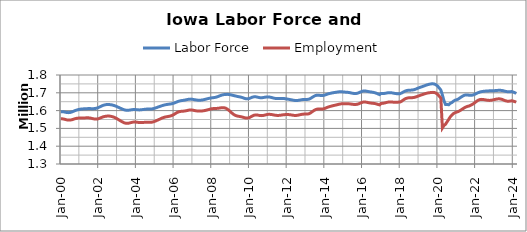
| Category |  Labor Force  |  Employment  |
|---|---|---|
| 2000-01-01 | 1593903 | 1554073 |
| 2000-02-01 | 1593990 | 1553843 |
| 2000-03-01 | 1592732 | 1552218 |
| 2000-04-01 | 1590764 | 1549882 |
| 2000-05-01 | 1589019 | 1547705 |
| 2000-06-01 | 1588514 | 1546565 |
| 2000-07-01 | 1589606 | 1546820 |
| 2000-08-01 | 1592249 | 1548545 |
| 2000-09-01 | 1595899 | 1551361 |
| 2000-10-01 | 1599621 | 1554252 |
| 2000-11-01 | 1602761 | 1556340 |
| 2000-12-01 | 1605280 | 1557642 |
| 2001-01-01 | 1607287 | 1558411 |
| 2001-02-01 | 1608759 | 1558748 |
| 2001-03-01 | 1609527 | 1558694 |
| 2001-04-01 | 1610026 | 1558753 |
| 2001-05-01 | 1610648 | 1559211 |
| 2001-06-01 | 1611094 | 1559480 |
| 2001-07-01 | 1611270 | 1559066 |
| 2001-08-01 | 1611115 | 1557650 |
| 2001-09-01 | 1610881 | 1555541 |
| 2001-10-01 | 1611068 | 1553561 |
| 2001-11-01 | 1611932 | 1552302 |
| 2001-12-01 | 1613910 | 1552463 |
| 2002-01-01 | 1617279 | 1554488 |
| 2002-02-01 | 1621675 | 1557984 |
| 2002-03-01 | 1626062 | 1561775 |
| 2002-04-01 | 1629632 | 1564963 |
| 2002-05-01 | 1632129 | 1567238 |
| 2002-06-01 | 1633682 | 1568717 |
| 2002-07-01 | 1634265 | 1569350 |
| 2002-08-01 | 1633924 | 1569033 |
| 2002-09-01 | 1632768 | 1567716 |
| 2002-10-01 | 1630876 | 1565447 |
| 2002-11-01 | 1628403 | 1562380 |
| 2002-12-01 | 1625147 | 1558284 |
| 2003-01-01 | 1621262 | 1553269 |
| 2003-02-01 | 1617184 | 1547884 |
| 2003-03-01 | 1613222 | 1542602 |
| 2003-04-01 | 1609268 | 1537462 |
| 2003-05-01 | 1605585 | 1532841 |
| 2003-06-01 | 1602990 | 1529681 |
| 2003-07-01 | 1601794 | 1528425 |
| 2003-08-01 | 1601957 | 1529011 |
| 2003-09-01 | 1603110 | 1530971 |
| 2003-10-01 | 1604550 | 1533278 |
| 2003-11-01 | 1605690 | 1535107 |
| 2003-12-01 | 1606085 | 1535920 |
| 2004-01-01 | 1605504 | 1535411 |
| 2004-02-01 | 1604405 | 1534065 |
| 2004-03-01 | 1603910 | 1533044 |
| 2004-04-01 | 1604462 | 1532911 |
| 2004-05-01 | 1605634 | 1533356 |
| 2004-06-01 | 1606835 | 1533841 |
| 2004-07-01 | 1607946 | 1534316 |
| 2004-08-01 | 1608630 | 1534570 |
| 2004-09-01 | 1608698 | 1534430 |
| 2004-10-01 | 1608704 | 1534379 |
| 2004-11-01 | 1609289 | 1535112 |
| 2004-12-01 | 1611006 | 1537097 |
| 2005-01-01 | 1613752 | 1540278 |
| 2005-02-01 | 1616939 | 1544054 |
| 2005-03-01 | 1620079 | 1547950 |
| 2005-04-01 | 1623189 | 1551978 |
| 2005-05-01 | 1626381 | 1556181 |
| 2005-06-01 | 1629285 | 1560026 |
| 2005-07-01 | 1631666 | 1562922 |
| 2005-08-01 | 1633524 | 1564894 |
| 2005-09-01 | 1635007 | 1566429 |
| 2005-10-01 | 1636188 | 1568012 |
| 2005-11-01 | 1637386 | 1570143 |
| 2005-12-01 | 1639110 | 1573366 |
| 2006-01-01 | 1641849 | 1578060 |
| 2006-02-01 | 1645442 | 1583664 |
| 2006-03-01 | 1649127 | 1588911 |
| 2006-04-01 | 1652328 | 1592837 |
| 2006-05-01 | 1654729 | 1595166 |
| 2006-06-01 | 1656339 | 1596192 |
| 2006-07-01 | 1657590 | 1596824 |
| 2006-08-01 | 1659099 | 1597910 |
| 2006-09-01 | 1661018 | 1599582 |
| 2006-10-01 | 1662986 | 1601611 |
| 2006-11-01 | 1664385 | 1603265 |
| 2006-12-01 | 1664469 | 1603613 |
| 2007-01-01 | 1663289 | 1602493 |
| 2007-02-01 | 1661602 | 1600672 |
| 2007-03-01 | 1659975 | 1598932 |
| 2007-04-01 | 1658797 | 1597745 |
| 2007-05-01 | 1658248 | 1597178 |
| 2007-06-01 | 1658520 | 1597354 |
| 2007-07-01 | 1659537 | 1598096 |
| 2007-08-01 | 1661174 | 1599243 |
| 2007-09-01 | 1663352 | 1600949 |
| 2007-10-01 | 1665743 | 1603116 |
| 2007-11-01 | 1667996 | 1605547 |
| 2007-12-01 | 1670033 | 1608126 |
| 2008-01-01 | 1671514 | 1610160 |
| 2008-02-01 | 1672496 | 1611271 |
| 2008-03-01 | 1673699 | 1611773 |
| 2008-04-01 | 1675641 | 1612124 |
| 2008-05-01 | 1678567 | 1612887 |
| 2008-06-01 | 1682183 | 1614205 |
| 2008-07-01 | 1685651 | 1615698 |
| 2008-08-01 | 1688328 | 1616614 |
| 2008-09-01 | 1689996 | 1616033 |
| 2008-10-01 | 1690958 | 1613479 |
| 2008-11-01 | 1691223 | 1608748 |
| 2008-12-01 | 1690582 | 1602026 |
| 2009-01-01 | 1689096 | 1594063 |
| 2009-02-01 | 1687015 | 1585947 |
| 2009-03-01 | 1684717 | 1578852 |
| 2009-04-01 | 1682539 | 1573692 |
| 2009-05-01 | 1680503 | 1570351 |
| 2009-06-01 | 1678718 | 1568344 |
| 2009-07-01 | 1676953 | 1566823 |
| 2009-08-01 | 1674750 | 1565031 |
| 2009-09-01 | 1671946 | 1562768 |
| 2009-10-01 | 1668747 | 1560093 |
| 2009-11-01 | 1666336 | 1558033 |
| 2009-12-01 | 1666046 | 1557898 |
| 2010-01-01 | 1668161 | 1560395 |
| 2010-02-01 | 1671781 | 1564951 |
| 2010-03-01 | 1675368 | 1570007 |
| 2010-04-01 | 1677557 | 1573836 |
| 2010-05-01 | 1677764 | 1575622 |
| 2010-06-01 | 1676132 | 1575290 |
| 2010-07-01 | 1673866 | 1573698 |
| 2010-08-01 | 1672341 | 1572218 |
| 2010-09-01 | 1672191 | 1571768 |
| 2010-10-01 | 1673392 | 1572819 |
| 2010-11-01 | 1675189 | 1574964 |
| 2010-12-01 | 1676546 | 1577238 |
| 2011-01-01 | 1676887 | 1578751 |
| 2011-02-01 | 1676002 | 1579056 |
| 2011-03-01 | 1674053 | 1578220 |
| 2011-04-01 | 1671639 | 1576628 |
| 2011-05-01 | 1669479 | 1574841 |
| 2011-06-01 | 1668016 | 1573438 |
| 2011-07-01 | 1667412 | 1572853 |
| 2011-08-01 | 1667469 | 1573169 |
| 2011-09-01 | 1667811 | 1574205 |
| 2011-10-01 | 1668085 | 1575631 |
| 2011-11-01 | 1667807 | 1576906 |
| 2011-12-01 | 1666736 | 1577591 |
| 2012-01-01 | 1665187 | 1577773 |
| 2012-02-01 | 1663580 | 1577533 |
| 2012-03-01 | 1662015 | 1576690 |
| 2012-04-01 | 1660230 | 1575227 |
| 2012-05-01 | 1658427 | 1573642 |
| 2012-06-01 | 1657167 | 1572697 |
| 2012-07-01 | 1656736 | 1572880 |
| 2012-08-01 | 1657235 | 1574109 |
| 2012-09-01 | 1658681 | 1576085 |
| 2012-10-01 | 1660482 | 1578228 |
| 2012-11-01 | 1661913 | 1579766 |
| 2012-12-01 | 1662647 | 1580457 |
| 2013-01-01 | 1662643 | 1580382 |
| 2013-02-01 | 1662690 | 1580469 |
| 2013-03-01 | 1664171 | 1582269 |
| 2013-04-01 | 1668153 | 1586806 |
| 2013-05-01 | 1673821 | 1593137 |
| 2013-06-01 | 1679506 | 1599483 |
| 2013-07-01 | 1683993 | 1604608 |
| 2013-08-01 | 1686408 | 1607835 |
| 2013-09-01 | 1686554 | 1609044 |
| 2013-10-01 | 1685404 | 1608832 |
| 2013-11-01 | 1684452 | 1608558 |
| 2013-12-01 | 1684792 | 1609386 |
| 2014-01-01 | 1686880 | 1611910 |
| 2014-02-01 | 1690118 | 1615655 |
| 2014-03-01 | 1693311 | 1619332 |
| 2014-04-01 | 1695751 | 1622168 |
| 2014-05-01 | 1697727 | 1624533 |
| 2014-06-01 | 1699665 | 1626906 |
| 2014-07-01 | 1701256 | 1628984 |
| 2014-08-01 | 1702696 | 1630943 |
| 2014-09-01 | 1704150 | 1633086 |
| 2014-10-01 | 1705341 | 1635343 |
| 2014-11-01 | 1705842 | 1637265 |
| 2014-12-01 | 1705596 | 1638437 |
| 2015-01-01 | 1704798 | 1638800 |
| 2015-02-01 | 1703904 | 1638715 |
| 2015-03-01 | 1703231 | 1638687 |
| 2015-04-01 | 1702323 | 1638444 |
| 2015-05-01 | 1700817 | 1637661 |
| 2015-06-01 | 1698838 | 1636400 |
| 2015-07-01 | 1697034 | 1635142 |
| 2015-08-01 | 1696005 | 1634411 |
| 2015-09-01 | 1696155 | 1634605 |
| 2015-10-01 | 1697907 | 1636189 |
| 2015-11-01 | 1701237 | 1639252 |
| 2015-12-01 | 1705328 | 1643195 |
| 2016-01-01 | 1708738 | 1646660 |
| 2016-02-01 | 1710383 | 1648419 |
| 2016-03-01 | 1710050 | 1648133 |
| 2016-04-01 | 1708496 | 1646486 |
| 2016-05-01 | 1706702 | 1644496 |
| 2016-06-01 | 1705132 | 1642812 |
| 2016-07-01 | 1703877 | 1641745 |
| 2016-08-01 | 1702459 | 1640827 |
| 2016-09-01 | 1700400 | 1639444 |
| 2016-10-01 | 1697326 | 1637247 |
| 2016-11-01 | 1693569 | 1634566 |
| 2016-12-01 | 1689919 | 1632092 |
| 2017-01-01 | 1696536 | 1640207 |
| 2017-02-01 | 1695743 | 1640706 |
| 2017-03-01 | 1696350 | 1642428 |
| 2017-04-01 | 1697896 | 1644766 |
| 2017-05-01 | 1699561 | 1646955 |
| 2017-06-01 | 1700553 | 1648287 |
| 2017-07-01 | 1700544 | 1648568 |
| 2017-08-01 | 1699477 | 1648009 |
| 2017-09-01 | 1697774 | 1647100 |
| 2017-10-01 | 1696152 | 1646476 |
| 2017-11-01 | 1695053 | 1646441 |
| 2017-12-01 | 1695075 | 1647607 |
| 2018-01-01 | 1694988 | 1647790 |
| 2018-02-01 | 1698795 | 1652673 |
| 2018-03-01 | 1703856 | 1658815 |
| 2018-04-01 | 1708600 | 1664626 |
| 2018-05-01 | 1711978 | 1668837 |
| 2018-06-01 | 1713875 | 1671232 |
| 2018-07-01 | 1714584 | 1672132 |
| 2018-08-01 | 1715034 | 1672377 |
| 2018-09-01 | 1715931 | 1672825 |
| 2018-10-01 | 1717712 | 1674025 |
| 2018-11-01 | 1720630 | 1676341 |
| 2018-12-01 | 1724481 | 1679734 |
| 2019-01-01 | 1728011 | 1682959 |
| 2019-02-01 | 1731250 | 1686157 |
| 2019-03-01 | 1734287 | 1689182 |
| 2019-04-01 | 1737506 | 1692277 |
| 2019-05-01 | 1740775 | 1695213 |
| 2019-06-01 | 1743894 | 1697686 |
| 2019-07-01 | 1746635 | 1699505 |
| 2019-08-01 | 1748715 | 1700716 |
| 2019-09-01 | 1750192 | 1701873 |
| 2019-10-01 | 1750527 | 1702461 |
| 2019-11-01 | 1748969 | 1701521 |
| 2019-12-01 | 1744486 | 1697677 |
| 2020-01-01 | 1736963 | 1690571 |
| 2020-02-01 | 1726944 | 1680896 |
| 2020-03-01 | 1715716 | 1670518 |
| 2020-04-01 | 1687546 | 1502326 |
| 2020-05-01 | 1655090 | 1516112 |
| 2020-06-01 | 1633896 | 1523566 |
| 2020-07-01 | 1634152 | 1537126 |
| 2020-08-01 | 1632757 | 1550728 |
| 2020-09-01 | 1640760 | 1564510 |
| 2020-10-01 | 1645223 | 1574963 |
| 2020-11-01 | 1652535 | 1583073 |
| 2020-12-01 | 1658125 | 1587944 |
| 2021-01-01 | 1660626 | 1591353 |
| 2021-02-01 | 1664447 | 1594351 |
| 2021-03-01 | 1670183 | 1598996 |
| 2021-04-01 | 1676553 | 1604506 |
| 2021-05-01 | 1681741 | 1610232 |
| 2021-06-01 | 1686356 | 1615870 |
| 2021-07-01 | 1688119 | 1620274 |
| 2021-08-01 | 1688101 | 1623689 |
| 2021-09-01 | 1686143 | 1625951 |
| 2021-10-01 | 1686056 | 1629869 |
| 2021-11-01 | 1686679 | 1634357 |
| 2021-12-01 | 1689314 | 1640267 |
| 2022-01-01 | 1693242 | 1646967 |
| 2022-02-01 | 1697781 | 1653846 |
| 2022-03-01 | 1701636 | 1659077 |
| 2022-04-01 | 1704691 | 1662287 |
| 2022-05-22 | 1706609 | 1663078 |
| 2022-06-22 | 1708048 | 1662431 |
| 2022-07-22 | 1709146 | 1660766 |
| 2022-08-22 | 1710100 | 1659001 |
| 2022-09-22 | 1710563 | 1657606 |
| 2022-10-22 | 1710997 | 1657303 |
| 2022-11-22 | 1711150 | 1657978 |
| 2022-12-01 | 1711361 | 1659539 |
| 2023-01-01 | 1711935 | 1661689 |
| 2023-02-01 | 1712747 | 1663885 |
| 2023-03-01 | 1713494 | 1665580 |
| 2023-04-01 | 1713945 | 1666233 |
| 2023-05-01 | 1713806 | 1665298 |
| 2023-06-01 | 1712894 | 1662838 |
| 2023-07-01 | 1710914 | 1659220 |
| 2023-08-01 | 1708587 | 1655721 |
| 2023-09-01 | 1706618 | 1653317 |
| 2023-10-01 | 1705476 | 1652482 |
| 2023-11-01 | 1705805 | 1653484 |
| 2023-12-01 | 1706995 | 1654960 |
| 2024-01-01 | 1704754 | 1653677 |
| 2024-02-01 | 1700901 | 1650719 |
| 2024-03-01 | 1696909 | 1648185 |